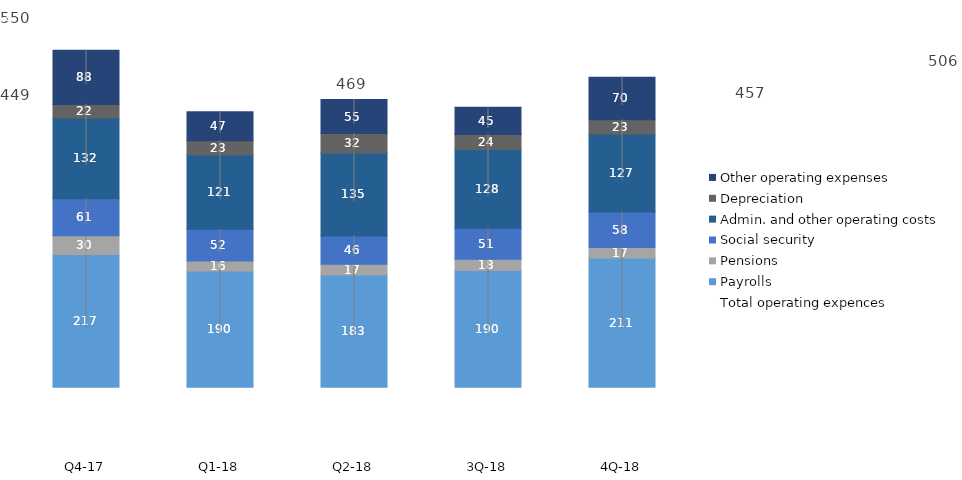
| Category | Payrolls | Pensions | Social security | Admin. and other operating costs | Depreciation | Other operating expenses |
|---|---|---|---|---|---|---|
| 4Q-18 | 210.902 | 16.926 | 58.219 | 127.179 | 23.057 | 69.672 |
| 3Q-18 | 190.273 | 18.438 | 50.778 | 128.41 | 24.363 | 44.712 |
| Q2-18 | 183.153 | 17.319 | 46.468 | 135.219 | 31.886 | 55.331 |
| Q1-18 | 189.7 | 16.4 | 51.6 | 121.4 | 23.2 | 47.1 |
| Q4-17 | 216.6 | 30.4 | 60.6 | 131.8 | 22 | 88.4 |